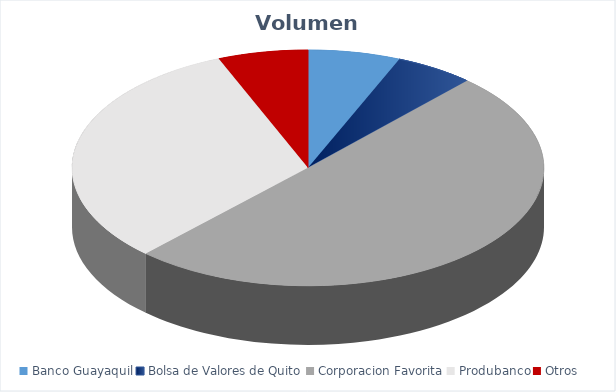
| Category | VOLUMEN ($USD) |
|---|---|
| Banco Guayaquil | 3486.17 |
| Bolsa de Valores de Quito | 3000.8 |
| Corporacion Favorita | 27753.57 |
| Produbanco | 17535.7 |
| Otros | 3402.8 |